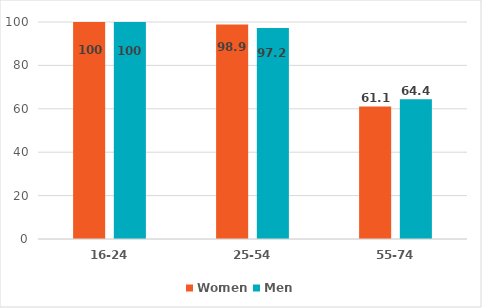
| Category | Women | Men |
|---|---|---|
| 16-24 | 100 | 100 |
| 25-54 | 98.9 | 97.2 |
| 55-74 | 61.1 | 64.4 |